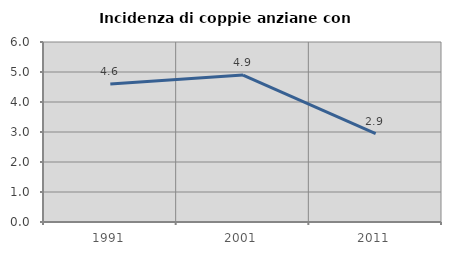
| Category | Incidenza di coppie anziane con figli |
|---|---|
| 1991.0 | 4.604 |
| 2001.0 | 4.897 |
| 2011.0 | 2.949 |